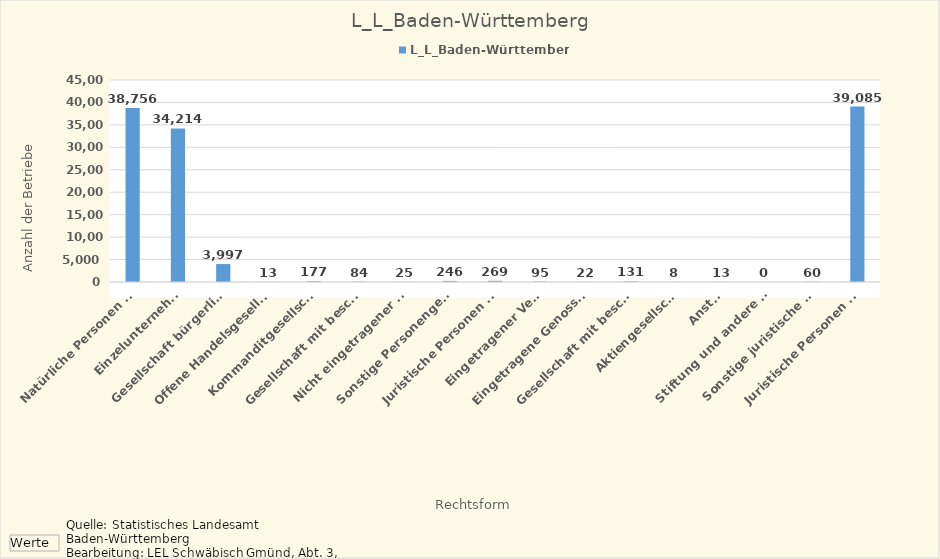
| Category | L_L_Baden-Württemberg |
|---|---|
| Natürliche Personen zusammen | 38756 |
| Einzelunternehmen | 34214 |
| Gesellschaft bürgerlichen Rechts | 3997 |
| Offene Handelsgesellschaft | 13 |
| Kommanditgesellschaft | 177 |
| Gesellschaft mit beschränkter Haftung 1) | 84 |
| Nicht eingetragener Verein | 25 |
| Sonstige Personengesellschaft | 246 |
| Juristische Personen des privaten Rechts zusammen | 269 |
| Eingetragener Verein | 95 |
| Eingetragene Genossenschaft | 22 |
| Gesellschaft mit beschränkter Haftung | 131 |
| Aktiengesellschaft | 8 |
| Anstalt, Stiftung und andere Zweckvermögen | 13 |
| Sonstige juristische Personen des privaten Rechts | 0 |
| Juristische Personen des öffentlichen Rechts zusammen | 60 |
| Betriebe insgesamt | 39085 |